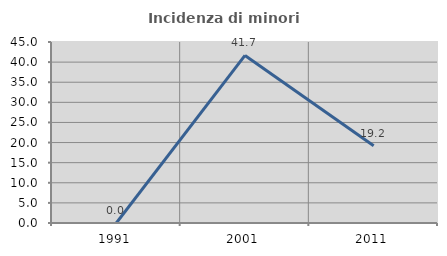
| Category | Incidenza di minori stranieri |
|---|---|
| 1991.0 | 0 |
| 2001.0 | 41.667 |
| 2011.0 | 19.231 |